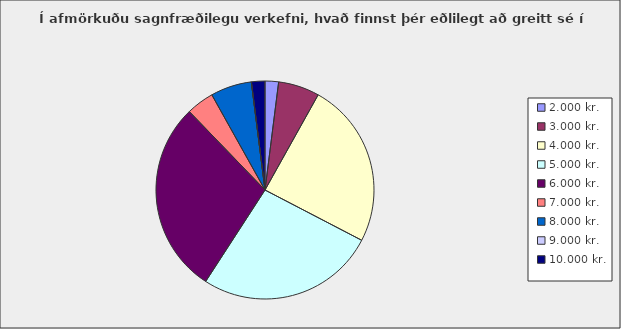
| Category | Series 0 |
|---|---|
| 2.000 kr. | 0.02 |
| 3.000 kr. | 0.061 |
| 4.000 kr. | 0.245 |
| 5.000 kr. | 0.265 |
| 6.000 kr. | 0.286 |
| 7.000 kr. | 0.041 |
| 8.000 kr. | 0.061 |
| 9.000 kr. | 0 |
| 10.000 kr. | 0.02 |